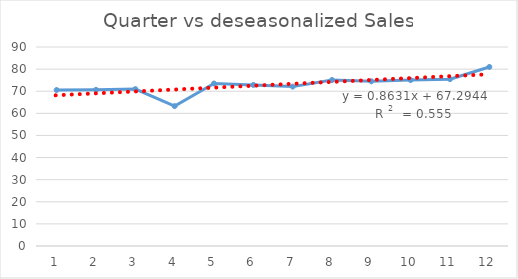
| Category | Series 0 |
|---|---|
| 0 | 70.548 |
| 1 | 70.633 |
| 2 | 70.961 |
| 3 | 63.263 |
| 4 | 73.488 |
| 5 | 72.841 |
| 6 | 72.088 |
| 7 | 75.072 |
| 8 | 74.468 |
| 9 | 75.048 |
| 10 | 75.467 |
| 11 | 80.976 |